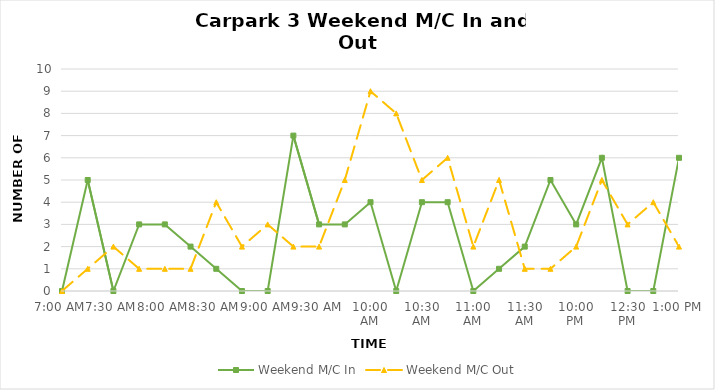
| Category | Weekend M/C In | Weekend M/C Out |
|---|---|---|
| 0.291666666666666 | 0 | 0 |
| 0.302083333333333 | 5 | 1 |
| 0.3125 | 0 | 2 |
| 0.322916666666667 | 3 | 1 |
| 0.333333333333333 | 3 | 1 |
| 0.34375 | 2 | 1 |
| 0.354166666666667 | 1 | 4 |
| 0.364583333333333 | 0 | 2 |
| 0.375 | 0 | 3 |
| 0.385416666666667 | 7 | 2 |
| 0.395833333333333 | 3 | 2 |
| 0.40625 | 3 | 5 |
| 0.416666666666667 | 4 | 9 |
| 0.427083333333333 | 0 | 8 |
| 0.4375 | 4 | 5 |
| 0.447916666666667 | 4 | 6 |
| 0.458333333333333 | 0 | 2 |
| 0.46875 | 1 | 5 |
| 0.479166666666667 | 2 | 1 |
| 0.489583333333333 | 5 | 1 |
| 0.5 | 3 | 2 |
| 0.510416666666667 | 6 | 5 |
| 0.520833333333333 | 0 | 3 |
| 0.53125 | 0 | 4 |
| 0.541666666666667 | 6 | 2 |